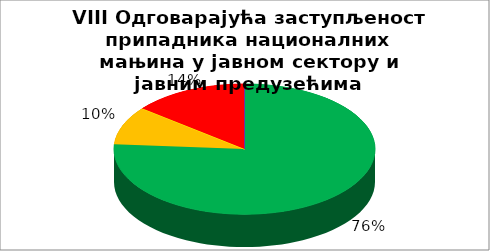
| Category | VIII Одговарајућа заступљеност припадника националних мањина у јавном сектору и јавним предузећима |
|---|---|
| 0 | 0.762 |
| 1 | 0.095 |
| 2 | 0 |
| 3 | 0.143 |
| 4 | 0 |